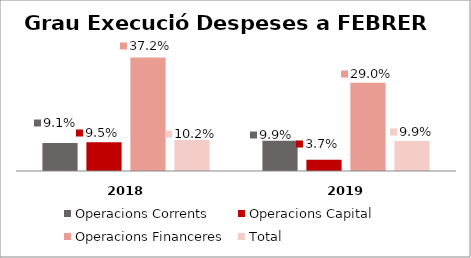
| Category | Operacions Corrents | Operacions Capital | Operacions Financeres | Total |
|---|---|---|---|---|
| 0 | 0.091 | 0.095 | 0.372 | 0.102 |
| 1 | 0.099 | 0.037 | 0.29 | 0.099 |